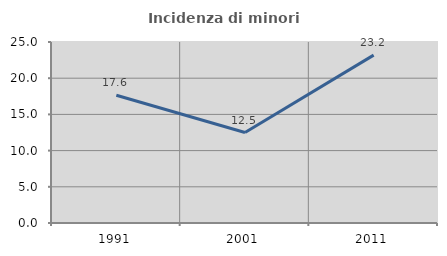
| Category | Incidenza di minori stranieri |
|---|---|
| 1991.0 | 17.647 |
| 2001.0 | 12.5 |
| 2011.0 | 23.188 |